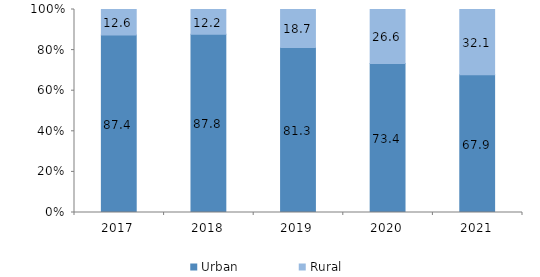
| Category | Urban | Rural |
|---|---|---|
| 2017.0 | 87.4 | 12.6 |
| 2018.0 | 87.8 | 12.2 |
| 2019.0 | 81.3 | 18.7 |
| 2020.0 | 73.4 | 26.6 |
| 2021.0 | 67.9 | 32.1 |